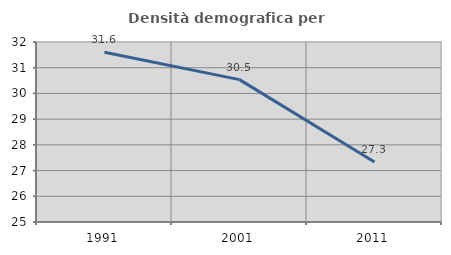
| Category | Densità demografica |
|---|---|
| 1991.0 | 31.604 |
| 2001.0 | 30.536 |
| 2011.0 | 27.333 |